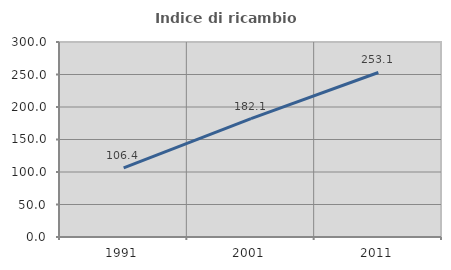
| Category | Indice di ricambio occupazionale  |
|---|---|
| 1991.0 | 106.383 |
| 2001.0 | 182.051 |
| 2011.0 | 253.125 |